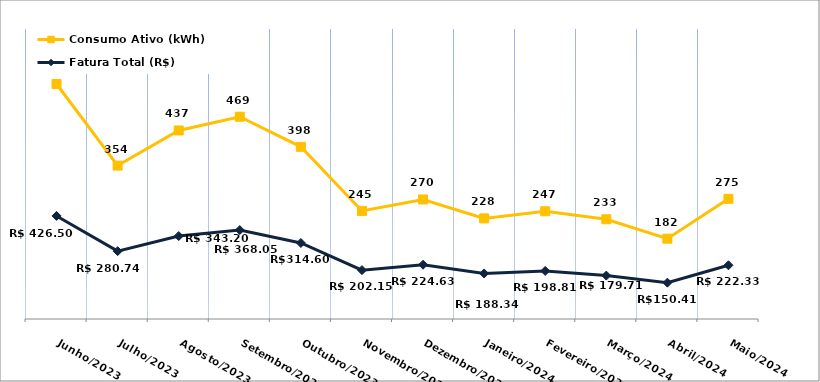
| Category | Fatura Total (R$) | Consumo Ativo (kWh) |
|---|---|---|
| Junho/2023 | 426.5 | 546 |
| Julho/2023 | 280.74 | 354 |
| Agosto/2023 | 343.2 | 437 |
| Setembro/2023 | 368.05 | 469 |
| Outubro/2023 | 314.6 | 398 |
| Novembro/2023 | 202.15 | 245 |
| Dezembro/2023 | 224.63 | 270 |
| Janeiro/2024 | 188.34 | 228 |
| Fevereiro/2024 | 198.81 | 247 |
| Março/2024 | 179.71 | 233 |
| Abril/2024 | 150.41 | 182 |
| Maio/2024 | 222.33 | 275 |